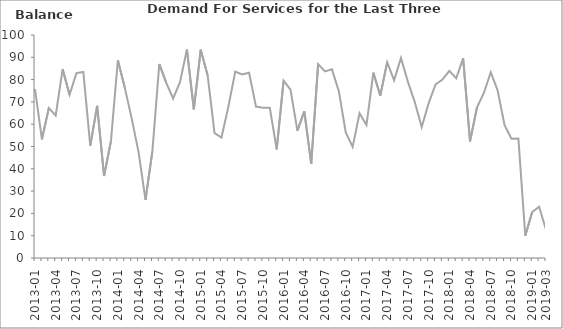
| Category | Balance |
|---|---|
| 2013-01 | 75.7 |
|  | 53.2 |
|  | 67.2 |
| 2013-04 | 63.9 |
|  | 84.7 |
|  | 73.2 |
| 2013-07 | 82.9 |
|  | 83.4 |
|  | 50.4 |
| 2013-10 | 68.2 |
|  | 36.8 |
|  | 52.5 |
| 2014-01 | 88.7 |
|  | 76.4 |
|  | 62.6 |
| 2014-04 | 47.5 |
|  | 26.1 |
|  | 47.9 |
| 2014-07 | 87 |
|  | 78.6 |
|  | 71.5 |
| 2014-10 | 78.9 |
|  | 93.5 |
|  | 66.6 |
| 2015-01 | 93.4 |
|  | 81.9 |
|  | 56 |
| 2015-04 | 54 |
|  | 67.8 |
|  | 83.6 |
| 2015-07 | 82.3 |
|  | 83.1 |
|  | 67.9 |
| 2015-10 | 67.4 |
|  | 67.4 |
|  | 48.7 |
| 2016-01 | 79.5 |
|  | 75.5 |
|  | 57.1 |
| 2016-04 | 65.8 |
|  | 42.2 |
|  | 87 |
| 2016-07 | 83.7 |
|  | 84.6 |
|  | 74.8 |
| 2016-10 | 56.3 |
|  | 49.8 |
|  | 64.9 |
| 2017-01 | 59.6 |
|  | 83.1 |
|  | 72.8 |
| 2017-04 | 87.8 |
|  | 79.7 |
|  | 89.7 |
| 2017-07 | 79 |
|  | 69.9 |
|  | 58.7 |
| 2017-10 | 69.4 |
|  | 77.8 |
|  | 80 |
| 2018-01 | 83.9 |
|  | 80.6 |
|  | 89.6 |
| 2018-04 | 52.3 |
|  | 67.5 |
|  | 74 |
| 2018-07 | 83.3 |
|  | 75.1 |
|  | 59.6 |
| 2018-10 | 53.5 |
|  | 53.6 |
|  | 10 |
| 2019-01 | 20.6 |
|  | 23 |
| 2019-03 | 12.7 |